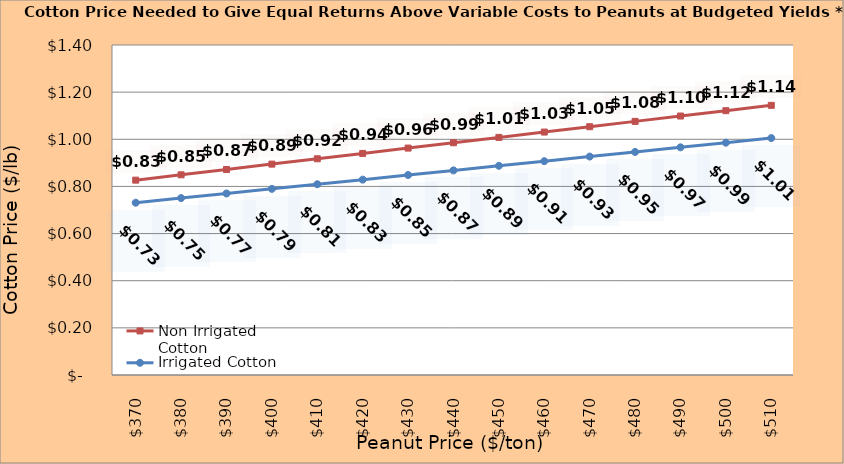
| Category | Non Irrigated Cotton | Irrigated Cotton |
|---|---|---|
| 370.0 | 0.827 | 0.731 |
| 380.0 | 0.849 | 0.75 |
| 390.0 | 0.872 | 0.77 |
| 400.0 | 0.895 | 0.79 |
| 410.0 | 0.917 | 0.809 |
| 420.0 | 0.94 | 0.829 |
| 430.0 | 0.963 | 0.848 |
| 440.0 | 0.985 | 0.868 |
| 450.0 | 1.008 | 0.888 |
| 460.0 | 1.031 | 0.907 |
| 470.0 | 1.053 | 0.927 |
| 480.0 | 1.076 | 0.946 |
| 490.0 | 1.099 | 0.966 |
| 500.0 | 1.121 | 0.985 |
| 510.0 | 1.144 | 1.005 |